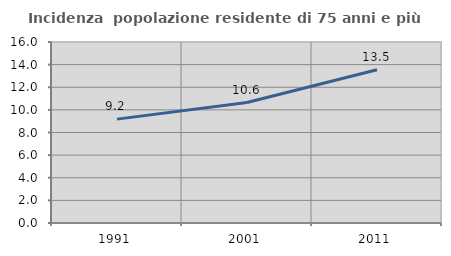
| Category | Incidenza  popolazione residente di 75 anni e più |
|---|---|
| 1991.0 | 9.182 |
| 2001.0 | 10.645 |
| 2011.0 | 13.543 |